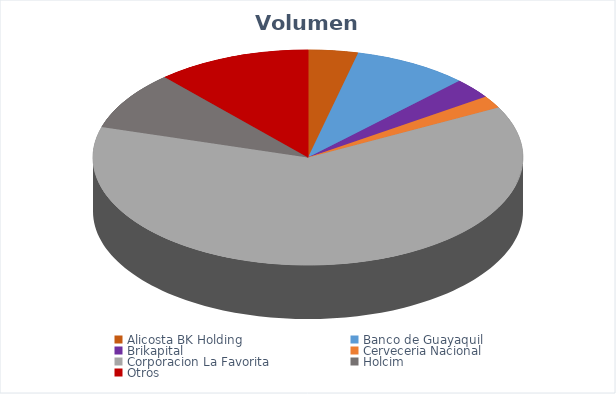
| Category | VOLUMEN ($USD) |
|---|---|
| Alicosta BK Holding | 6130 |
| Banco de Guayaquil | 14173.48 |
| Brikapital | 5000 |
| Cerveceria Nacional | 3060 |
| Corporacion La Favorita | 102036.63 |
| Holcim | 14461.5 |
| Otros | 19000 |